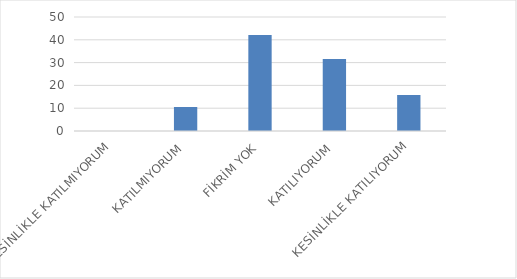
| Category | Series 0 |
|---|---|
| KESİNLİKLE KATILMIYORUM | 0 |
| KATILMIYORUM | 10.53 |
| FİKRİM YOK | 42.11 |
| KATILIYORUM | 31.58 |
| KESİNLİKLE KATILIYORUM | 15.79 |